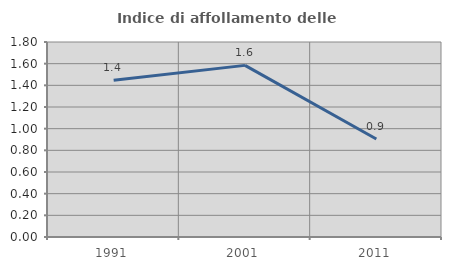
| Category | Indice di affollamento delle abitazioni  |
|---|---|
| 1991.0 | 1.446 |
| 2001.0 | 1.584 |
| 2011.0 | 0.904 |